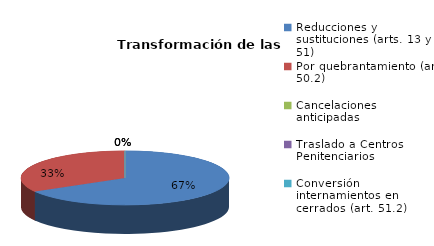
| Category | Series 0 |
|---|---|
| Reducciones y sustituciones (arts. 13 y 51) | 80 |
| Por quebrantamiento (art. 50.2) | 40 |
| Cancelaciones anticipadas | 0 |
| Traslado a Centros Penitenciarios | 0 |
| Conversión internamientos en cerrados (art. 51.2) | 0 |